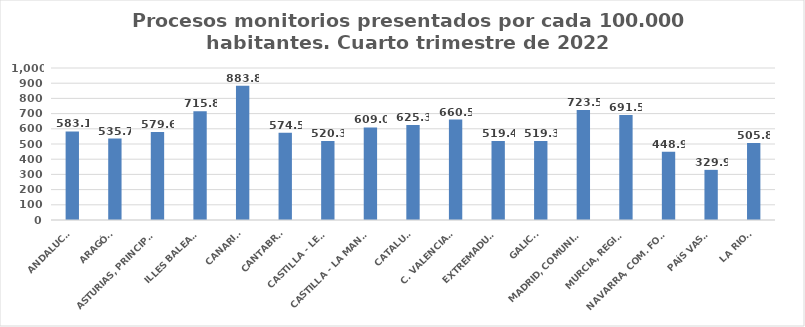
| Category | Series 0 |
|---|---|
| ANDALUCÍA | 583.055 |
| ARAGÓN | 535.695 |
| ASTURIAS, PRINCIPADO | 579.584 |
| ILLES BALEARS | 715.84 |
| CANARIAS | 883.776 |
| CANTABRIA | 574.477 |
| CASTILLA - LEÓN | 520.264 |
| CASTILLA - LA MANCHA | 608.963 |
| CATALUÑA | 625.285 |
| C. VALENCIANA | 660.499 |
| EXTREMADURA | 519.447 |
| GALICIA | 519.316 |
| MADRID, COMUNIDAD | 723.549 |
| MURCIA, REGIÓN | 691.504 |
| NAVARRA, COM. FORAL | 448.867 |
| PAÍS VASCO | 329.865 |
| LA RIOJA | 505.796 |